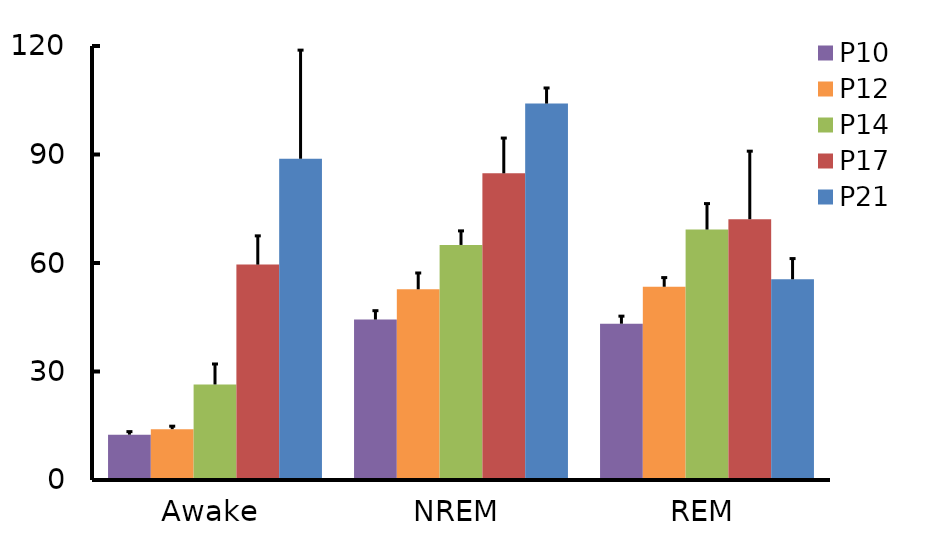
| Category | P10 | P12 | P14 | P17 | P21 |
|---|---|---|---|---|---|
| Awake | 12.544 | 14.058 | 26.417 | 59.555 | 88.827 |
| NREM | 44.359 | 52.731 | 64.993 | 84.797 | 104.081 |
| REM | 43.213 | 53.43 | 69.251 | 72.114 | 55.5 |